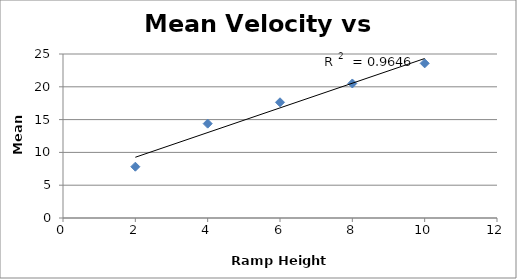
| Category | Mean Velocity |
|---|---|
| 2.0 | 7.821 |
| 4.0 | 14.383 |
| 6.0 | 17.641 |
| 8.0 | 20.506 |
| 10.0 | 23.573 |